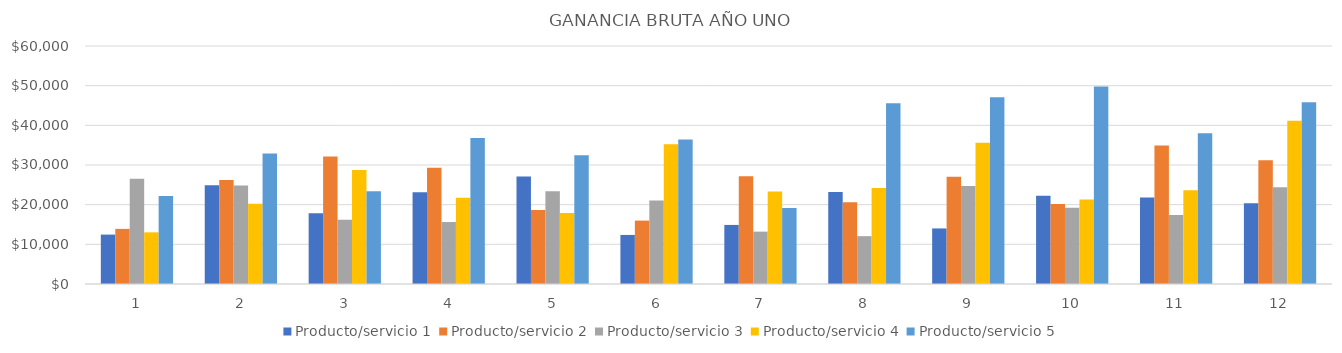
| Category | Producto/servicio 1 | Producto/servicio 2 | Producto/servicio 3 | Producto/servicio 4 | Producto/servicio 5 |
|---|---|---|---|---|---|
| 0 | 12453 | 13896 | 26541 | 13024 | 22200 |
| 1 | 24899 | 26232 | 24858 | 20218 | 32880 |
| 2 | 17822 | 32152 | 16218 | 28743 | 23385 |
| 3 | 23107.5 | 29287.5 | 15623 | 21766.5 | 36815.5 |
| 4 | 27131 | 18660 | 23400.5 | 17871 | 32465.5 |
| 5 | 12369.5 | 15982.5 | 21063 | 35238 | 36438.5 |
| 6 | 14891.5 | 27142.5 | 13200.5 | 23331 | 19140 |
| 7 | 23211.5 | 20602.5 | 12061.5 | 24202.5 | 45559 |
| 8 | 14007.5 | 27052.5 | 24726.5 | 35595 | 47052.5 |
| 9 | 22218 | 20160 | 19233 | 21329 | 49770 |
| 10 | 21780 | 34920 | 17376 | 23647 | 38000 |
| 11 | 20340 | 31170 | 24420 | 41158 | 45840 |